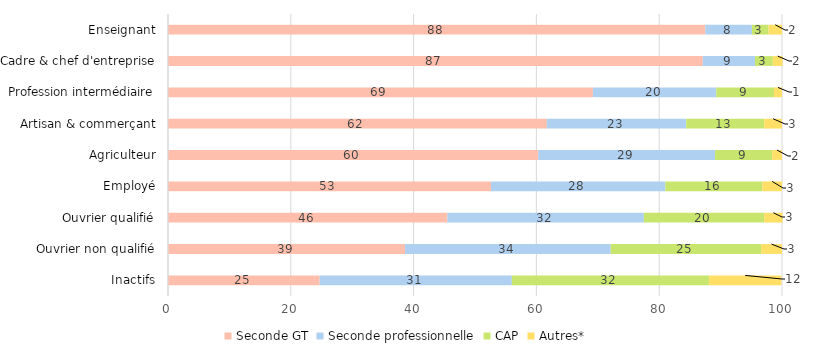
| Category | Seconde GT | Seconde professionnelle | CAP | Autres* |
|---|---|---|---|---|
| Inactifs | 24.7 | 31.3 | 32.1 | 11.8 |
| Ouvrier non qualifié | 38.6 | 33.5 | 24.5 | 3.4 |
| Ouvrier qualifié | 45.5 | 32 | 19.6 | 3 |
| Employé | 52.6 | 28.4 | 15.8 | 3.2 |
| Agriculteur | 60.3 | 28.8 | 9.3 | 1.6 |
| Artisan & commerçant | 61.7 | 22.7 | 12.7 | 2.9 |
| Profession intermédiaire | 69.2 | 20.1 | 9.4 | 1.3 |
| Cadre & chef d'entreprise | 87.1 | 8.5 | 2.9 | 1.6 |
| Enseignant | 87.5 | 7.6 | 2.7 | 2.2 |